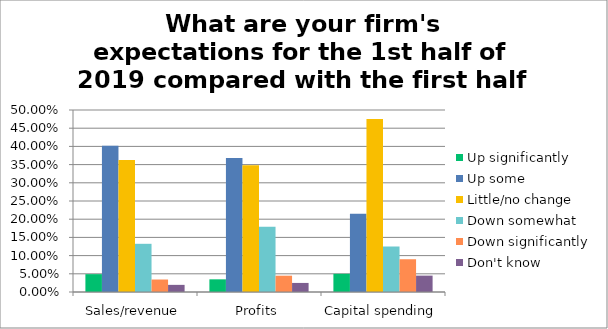
| Category | Up significantly | Up some | Little/no change | Down somewhat | Down significantly | Don't know |
|---|---|---|---|---|---|---|
| Sales/revenue | 0.049 | 0.402 | 0.363 | 0.132 | 0.034 | 0.02 |
| Profits | 0.035 | 0.368 | 0.348 | 0.179 | 0.045 | 0.025 |
| Capital spending | 0.05 | 0.215 | 0.475 | 0.125 | 0.09 | 0.045 |